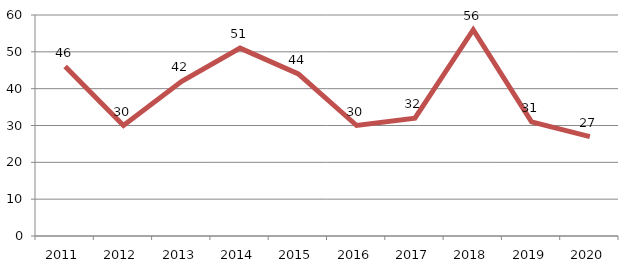
| Category | Contratos |
|---|---|
| 2011.0 | 46 |
| 2012.0 | 30 |
| 2013.0 | 42 |
| 2014.0 | 51 |
| 2015.0 | 44 |
| 2016.0 | 30 |
| 2017.0 | 32 |
| 2018.0 | 56 |
| 2019.0 | 31 |
| 2020.0 | 27 |